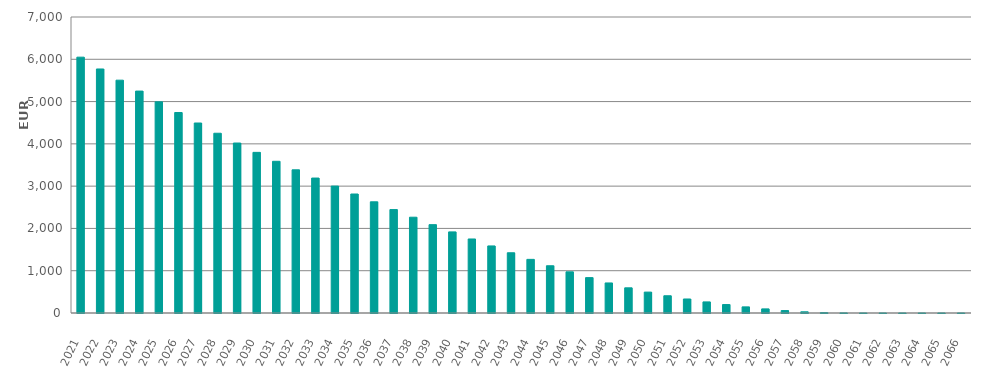
| Category | EUR Millions |
|---|---|
| 2021.0 | 6050000000.29 |
| 2022.0 | 5770798646.039 |
| 2023.0 | 5505706326.551 |
| 2024.0 | 5247913651.104 |
| 2025.0 | 4993440556.188 |
| 2026.0 | 4741527302.682 |
| 2027.0 | 4493211883.973 |
| 2028.0 | 4251038183.92 |
| 2029.0 | 4019570065.577 |
| 2030.0 | 3798737969.888 |
| 2031.0 | 3587615757.839 |
| 2032.0 | 3385877620.781 |
| 2033.0 | 3191371291.419 |
| 2034.0 | 3001444665.418 |
| 2035.0 | 2814164369.194 |
| 2036.0 | 2629247535.521 |
| 2037.0 | 2445480769.995 |
| 2038.0 | 2265329197.184 |
| 2039.0 | 2089093647.445 |
| 2040.0 | 1917694423.912 |
| 2041.0 | 1750620923.521 |
| 2042.0 | 1585741357.495 |
| 2043.0 | 1424463918.921 |
| 2044.0 | 1268344404.775 |
| 2045.0 | 1117396629.151 |
| 2046.0 | 973326399.953 |
| 2047.0 | 836923536.352 |
| 2048.0 | 710436503.996 |
| 2049.0 | 595382762.89 |
| 2050.0 | 494178672.182 |
| 2051.0 | 407833432.858 |
| 2052.0 | 331411793.372 |
| 2053.0 | 262081136.151 |
| 2054.0 | 199891871.576 |
| 2055.0 | 144761618.346 |
| 2056.0 | 96937934.88 |
| 2057.0 | 57471613.762 |
| 2058.0 | 28318812.187 |
| 2059.0 | 10139442.886 |
| 2060.0 | 1909641.459 |
| 2061.0 | 94413.607 |
| 2062.0 | 31701.663 |
| 2063.0 | 11433.896 |
| 2064.0 | 678.06 |
| 2065.0 | 0 |
| 2066.0 | 0 |